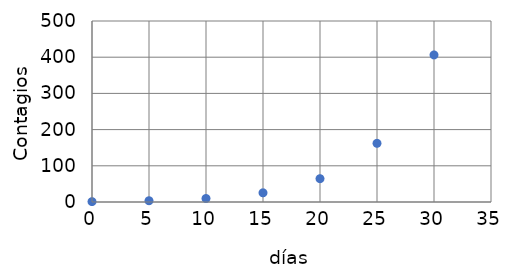
| Category | Total |
|---|---|
| 0.0 | 1 |
| 5.0 | 3.5 |
| 10.0 | 9.75 |
| 15.0 | 25.375 |
| 20.0 | 64.438 |
| 25.0 | 162.094 |
| 30.0 | 406.234 |